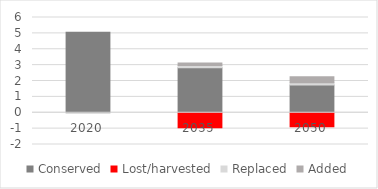
| Category | Conserved | Lost/harvested | Replaced | Added |
|---|---|---|---|---|
| 2020.0 | 5.077 | 0 | 0 | 0 |
| 2035.0 | 2.832 | -0.944 | 0.15 | 0.15 |
| 2050.0 | 1.75 | -0.875 | 0.139 | 0.371 |